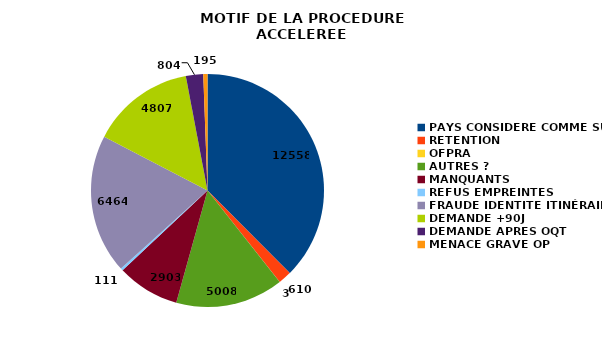
| Category | NOMBRE |
|---|---|
| PAYS CONSIDERE COMME SUR | 12558 |
| RETENTION | 610 |
| OFPRA | 3 |
| AUTRES ? | 5008 |
| MANQUANTS  | 2903 |
| REFUS EMPREINTES | 111 |
| FRAUDE IDENTITE ITINÉRAIRE | 6464 |
| DEMANDE +90J | 4807 |
| DEMANDE APRES OQT | 804 |
| MENACE GRAVE OP | 195 |